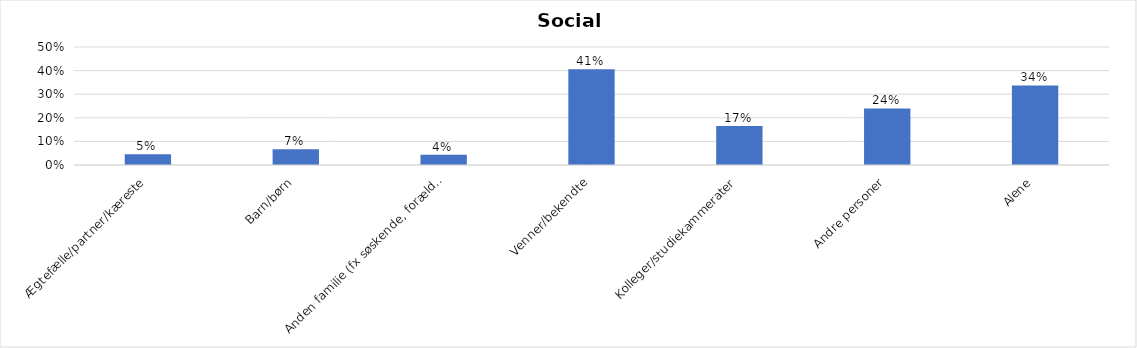
| Category | % |
|---|---|
| Ægtefælle/partner/kæreste | 0.045 |
| Barn/børn | 0.067 |
| Anden familie (fx søskende, forældre) | 0.044 |
| Venner/bekendte | 0.406 |
| Kolleger/studiekammerater | 0.166 |
| Andre personer | 0.24 |
| Alene | 0.337 |